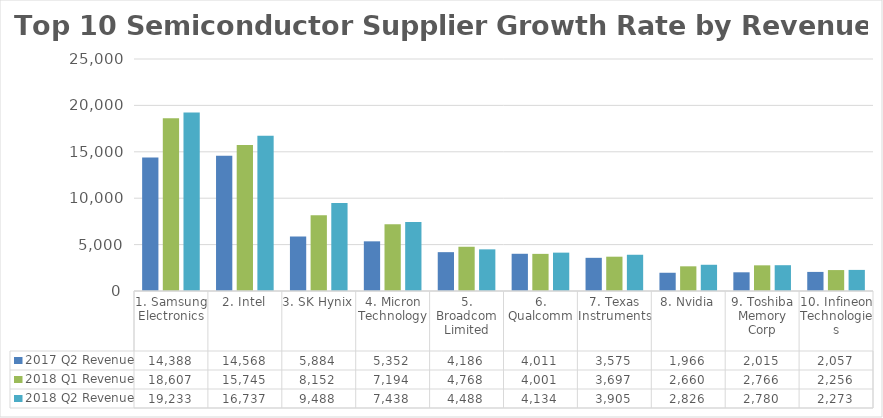
| Category | 2017 Q2 Revenue | 2018 Q1 Revenue | 2018 Q2 Revenue |
|---|---|---|---|
| 1. Samsung Electronics | 14388 | 18607 | 19233 |
| 2. Intel | 14568 | 15745 | 16737 |
| 3. SK Hynix | 5884 | 8152 | 9488 |
| 4. Micron Technology | 5352 | 7194 | 7438 |
| 5. Broadcom Limited | 4186 | 4768 | 4488 |
| 6. Qualcomm | 4011 | 4001 | 4134 |
| 7. Texas Instruments | 3575 | 3697 | 3905 |
| 8. Nvidia | 1966 | 2660 | 2826 |
| 9. Toshiba Memory Corp | 2015 | 2766 | 2780 |
| 10. Infineon Technologies | 2057 | 2256 | 2273 |